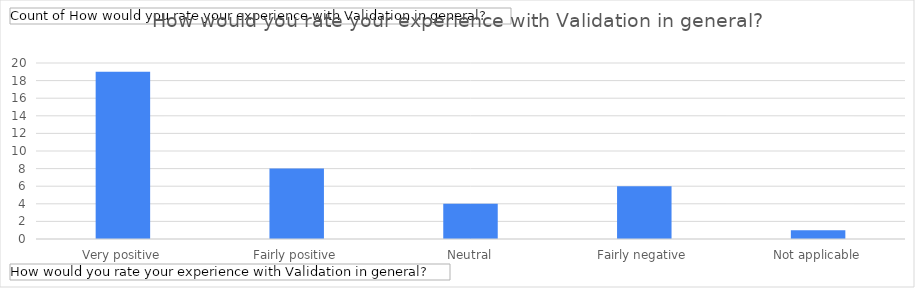
| Category | Total |
|---|---|
| Very positive | 19 |
| Fairly positive | 8 |
| Neutral | 4 |
| Fairly negative | 6 |
| Not applicable | 1 |